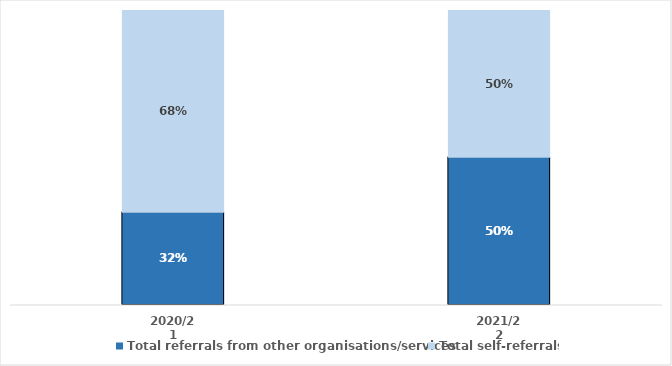
| Category | Total referrals from other organisations/services | Total self-referrals |
|---|---|---|
| 2020/21 | 0.316 | 0.684 |
| 2021/22 | 0.503 | 0.497 |